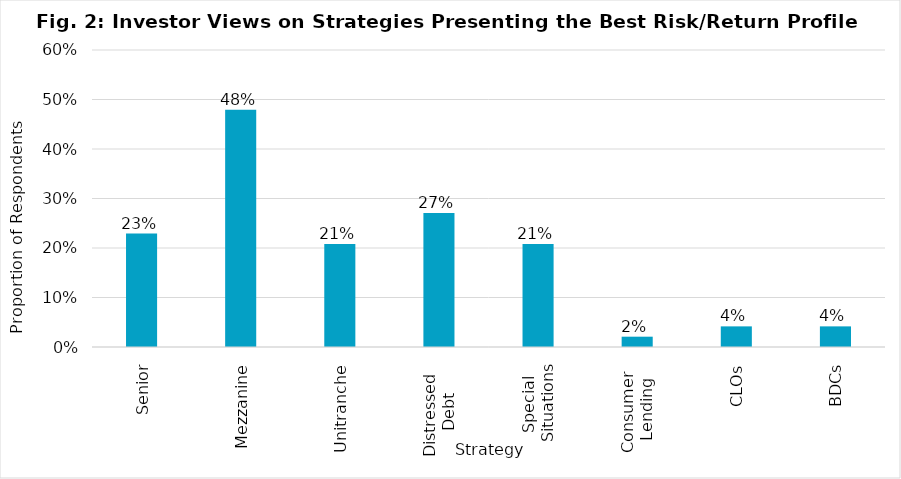
| Category | Proportion of Respondents |
|---|---|
| Senior | 0.229 |
| Mezzanine | 0.479 |
| Unitranche | 0.208 |
| Distressed 
Debt | 0.271 |
| Special 
Situations | 0.208 |
| Consumer 
Lending | 0.021 |
| CLOs | 0.042 |
| BDCs | 0.042 |